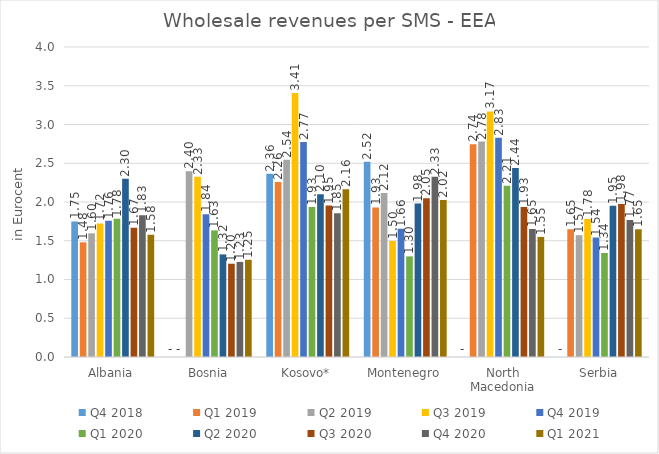
| Category | Q4 2018 | Q1 2019 | Q2 2019 | Q3 2019 | Q4 2019 | Q1 2020 | Q2 2020 | Q3 2020 | Q4 2020 | Q1 2021 |
|---|---|---|---|---|---|---|---|---|---|---|
| Albania | 1.75 | 1.48 | 1.596 | 1.724 | 1.757 | 1.782 | 2.301 | 1.667 | 1.829 | 1.577 |
| Bosnia | 0 | 0 | 2.396 | 2.327 | 1.843 | 1.634 | 1.324 | 1.204 | 1.227 | 1.254 |
| Kosovo* | 2.363 | 2.259 | 2.544 | 3.408 | 2.774 | 1.934 | 2.101 | 1.954 | 1.855 | 2.165 |
| Montenegro | 2.518 | 1.931 | 2.118 | 1.498 | 1.656 | 1.298 | 1.979 | 2.047 | 2.326 | 2.025 |
| North Macedonia | 0 | 2.745 | 2.78 | 3.169 | 2.829 | 2.208 | 2.438 | 1.935 | 1.653 | 1.549 |
| Serbia | 0 | 1.649 | 1.572 | 1.781 | 1.542 | 1.342 | 1.951 | 1.976 | 1.767 | 1.648 |